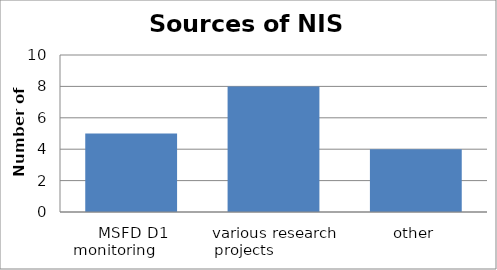
| Category | Member States |
|---|---|
| MSFD D1 monitoring         | 5 |
| various research projects              | 8 |
| other | 4 |